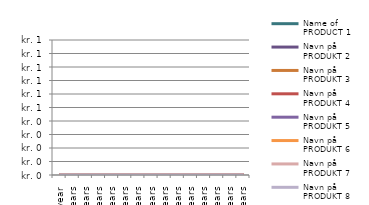
| Category | Name of PRODUCT 1 | Navn på PRODUKT 2 | Navn på PRODUKT 3 | Navn på PRODUKT 4 | Navn på PRODUKT 5 | Navn på PRODUKT 6 | Navn på PRODUKT 7 | Navn på PRODUKT 8 |
|---|---|---|---|---|---|---|---|---|
| 1 year | 0 | 0 | 0 | 0 | 0 | 0 | 0 | 0 |
| 2 years | 0 | 0 | 0 | 0 | 0 | 0 | 0 | 0 |
| 3 years | 0 | 0 | 0 | 0 | 0 | 0 | 0 | 0 |
| 4 years | 0 | 0 | 0 | 0 | 0 | 0 | 0 | 0 |
| 5 years | 0 | 0 | 0 | 0 | 0 | 0 | 0 | 0 |
| 6 years | 0 | 0 | 0 | 0 | 0 | 0 | 0 | 0 |
| 7 years | 0 | 0 | 0 | 0 | 0 | 0 | 0 | 0 |
| 8 years | 0 | 0 | 0 | 0 | 0 | 0 | 0 | 0 |
| 9 years | 0 | 0 | 0 | 0 | 0 | 0 | 0 | 0 |
| 10 years | 0 | 0 | 0 | 0 | 0 | 0 | 0 | 0 |
| 11 years | 0 | 0 | 0 | 0 | 0 | 0 | 0 | 0 |
| 12 years | 0 | 0 | 0 | 0 | 0 | 0 | 0 | 0 |
| 13 years | 0 | 0 | 0 | 0 | 0 | 0 | 0 | 0 |
| 14 years | 0 | 0 | 0 | 0 | 0 | 0 | 0 | 0 |
| 15 years | 0 | 0 | 0 | 0 | 0 | 0 | 0 | 0 |